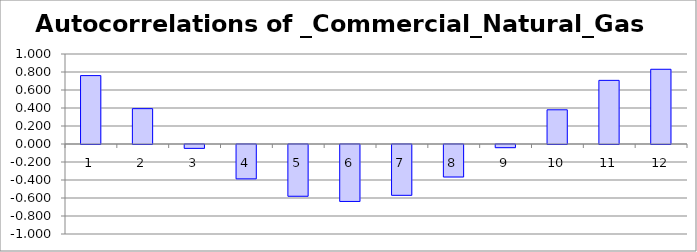
| Category | Autocorrelations of _Commercial_Natural_Gas |
|---|---|
| 0 | 0.76 |
| 1 | 0.393 |
| 2 | -0.043 |
| 3 | -0.382 |
| 4 | -0.575 |
| 5 | -0.633 |
| 6 | -0.565 |
| 7 | -0.361 |
| 8 | -0.035 |
| 9 | 0.38 |
| 10 | 0.707 |
| 11 | 0.83 |